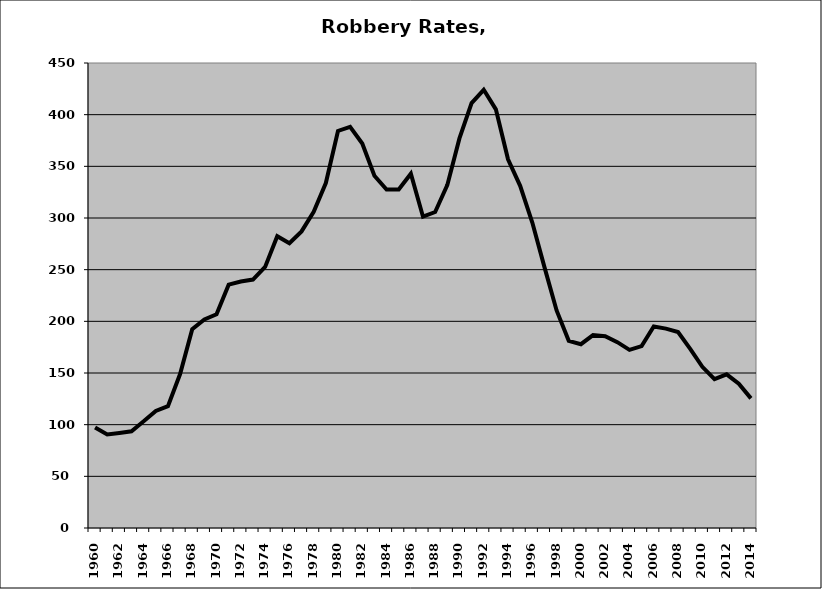
| Category | Robbery |
|---|---|
| 1960.0 | 97.263 |
| 1961.0 | 90.456 |
| 1962.0 | 91.915 |
| 1963.0 | 93.565 |
| 1964.0 | 103.224 |
| 1965.0 | 113.327 |
| 1966.0 | 117.967 |
| 1967.0 | 149.005 |
| 1968.0 | 192.451 |
| 1969.0 | 201.821 |
| 1970.0 | 206.87 |
| 1971.0 | 235.504 |
| 1972.0 | 238.563 |
| 1973.0 | 240.43 |
| 1974.0 | 252.652 |
| 1975.0 | 282.403 |
| 1976.0 | 275.641 |
| 1977.0 | 287.048 |
| 1978.0 | 306.069 |
| 1979.0 | 333.834 |
| 1980.0 | 384.232 |
| 1981.0 | 388.182 |
| 1982.0 | 372.06 |
| 1983.0 | 340.931 |
| 1984.0 | 327.547 |
| 1985.0 | 327.658 |
| 1986.0 | 342.878 |
| 1987.0 | 301.272 |
| 1988.0 | 305.812 |
| 1989.0 | 331.8 |
| 1990.0 | 377.043 |
| 1991.0 | 411.254 |
| 1992.0 | 424.068 |
| 1993.0 | 405.101 |
| 1994.0 | 356.845 |
| 1995.0 | 331.163 |
| 1996.0 | 295.571 |
| 1997.0 | 252.473 |
| 1998.0 | 210.555 |
| 1999.0 | 181.14 |
| 2000.0 | 177.874 |
| 2001.0 | 186.743 |
| 2002.0 | 185.612 |
| 2003.0 | 179.823 |
| 2004.0 | 172.334 |
| 2005.0 | 175.974 |
| 2006.0 | 194.95 |
| 2007.0 | 192.984 |
| 2008.0 | 189.678 |
| 2009.0 | 173.404 |
| 2010.0 | 156 |
| 2011.0 | 144.069 |
| 2012.0 | 148.74 |
| 2013.0 | 139.573 |
| 2014.0 | 125.456 |